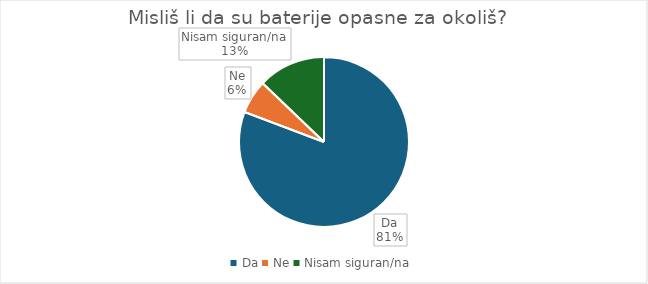
| Category | Series 0 |
|---|---|
| Da | 88 |
| Ne | 7 |
| Nisam siguran/na | 14 |